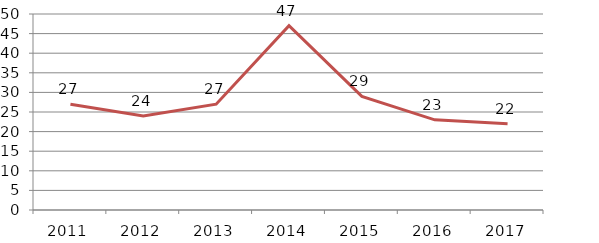
| Category | Contratos |
|---|---|
| 2011.0 | 27 |
| 2012.0 | 24 |
| 2013.0 | 27 |
| 2014.0 | 47 |
| 2015.0 | 29 |
| 2016.0 | 23 |
| 2017.0 | 22 |